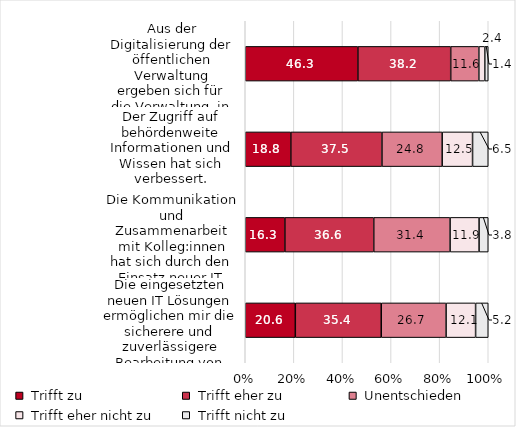
| Category | Series 0 | Series 1 | Series 2 | Series 3 | Series 4 |
|---|---|---|---|---|---|
| Aus der Digitalisierung der öffentlichen Verwaltung ergeben sich für die Verwaltung, in der ich arbeite, insgesamt mehr Chancen als Risiken. | 46.341 | 38.211 | 11.585 | 2.439 | 1.423 |
| Der Zugriff auf behördenweite Informationen und Wissen hat sich verbessert. | 18.75 | 37.5 | 24.792 | 12.5 | 6.458 |
| Die Kommunikation und Zusammenarbeit mit Kolleg:innen hat sich durch den Einsatz neuer IT Lösungen  verbessert. | 16.302 | 36.581 | 31.412 | 11.928 | 3.777 |
| Die eingesetzten neuen IT Lösungen ermöglichen mir die sicherere und zuverlässigere Bearbeitung von Anliegen, Anträgen und Verwaltungsakten. | 20.607 | 35.358 | 26.681 | 12.148 | 5.206 |